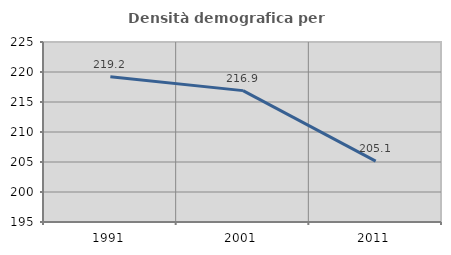
| Category | Densità demografica |
|---|---|
| 1991.0 | 219.22 |
| 2001.0 | 216.895 |
| 2011.0 | 205.134 |